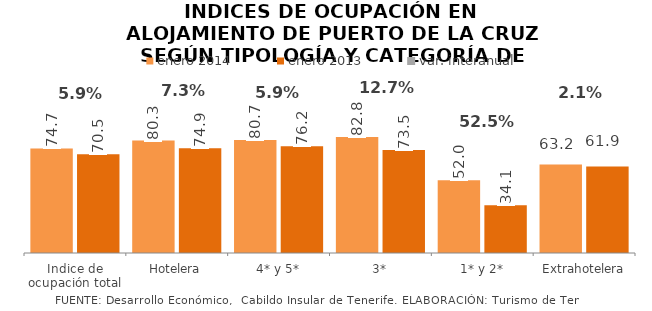
| Category | enero 2014 | enero 2013 |
|---|---|---|
| Indice de ocupación total | 74.72 | 70.529 |
| Hotelera | 80.315 | 74.857 |
| 4* y 5* | 80.693 | 76.197 |
| 3* | 82.81 | 73.504 |
| 1* y 2* | 51.991 | 34.093 |
| Extrahotelera | 63.18 | 61.855 |